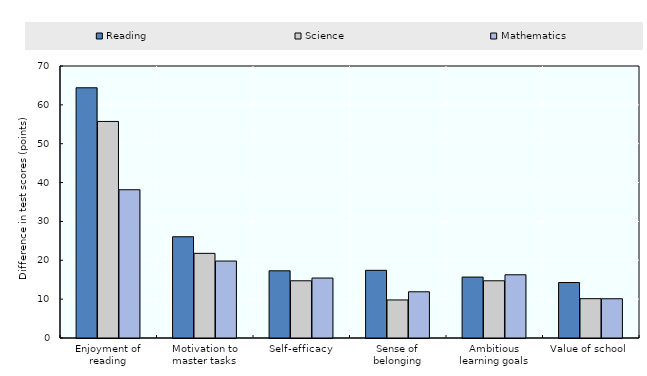
| Category | Reading | Science | Mathematics |
|---|---|---|---|
| Enjoyment of reading | 64.397 | 55.731 | 38.155 |
| Motivation to master tasks | 26.053 | 21.783 | 19.808 |
| Self-efficacy | 17.291 | 14.728 | 15.432 |
| Sense of belonging | 17.414 | 9.795 | 11.893 |
| Ambitious learning goals | 15.68 | 14.727 | 16.273 |
| Value of school | 14.272 | 10.123 | 10.105 |